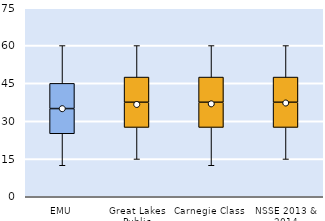
| Category | 25th | 50th | 75th |
|---|---|---|---|
| EMU | 25 | 10 | 10 |
| Great Lakes Public | 27.5 | 10 | 10 |
| Carnegie Class | 27.5 | 10 | 10 |
| NSSE 2013 & 2014 | 27.5 | 10 | 10 |